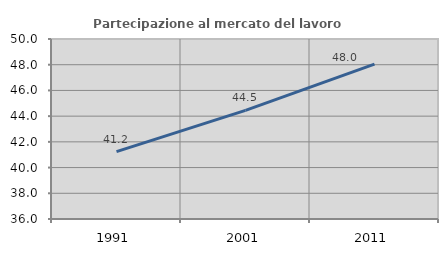
| Category | Partecipazione al mercato del lavoro  femminile |
|---|---|
| 1991.0 | 41.242 |
| 2001.0 | 44.452 |
| 2011.0 | 48.041 |